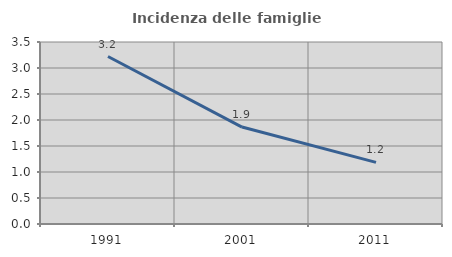
| Category | Incidenza delle famiglie numerose |
|---|---|
| 1991.0 | 3.221 |
| 2001.0 | 1.864 |
| 2011.0 | 1.185 |